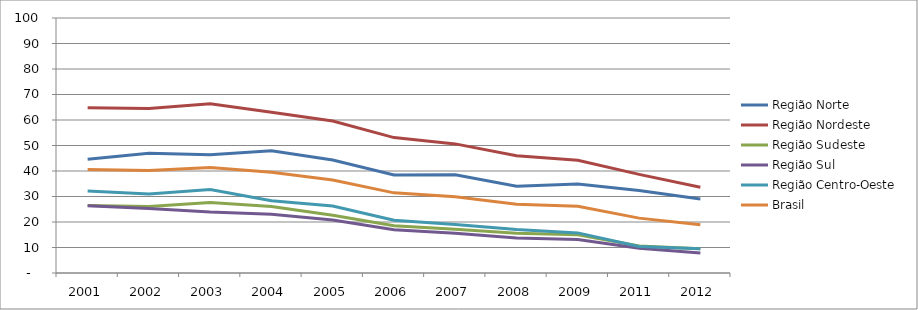
| Category | Região Norte | Região Nordeste | Região Sudeste | Região Sul | Região Centro-Oeste | Brasil |
|---|---|---|---|---|---|---|
| 2001.0 | 44.6 | 64.79 | 26.47 | 26.38 | 32.16 | 40.56 |
| 2002.0 | 46.98 | 64.47 | 26.04 | 25.34 | 31.02 | 40.22 |
| 2003.0 | 46.39 | 66.34 | 27.68 | 23.88 | 32.75 | 41.41 |
| 2004.0 | 47.94 | 63 | 26.08 | 23.01 | 28.35 | 39.51 |
| 2005.0 | 44.31 | 59.58 | 22.67 | 20.82 | 26.24 | 36.47 |
| 2006.0 | 38.47 | 53.1 | 18.49 | 16.97 | 20.7 | 31.43 |
| 2007.0 | 38.51 | 50.63 | 17.2 | 15.62 | 18.99 | 29.87 |
| 2008.0 | 34.05 | 46.02 | 15.56 | 13.72 | 17.06 | 26.99 |
| 2009.0 | 34.88 | 44.22 | 14.96 | 13.09 | 15.73 | 26.14 |
| 2011.0 | 32.33 | 38.69 | 10.55 | 9.71 | 10.42 | 21.52 |
| 2012.0 | 28.99 | 33.6 | 9.47 | 7.84 | 9.5 | 18.88 |